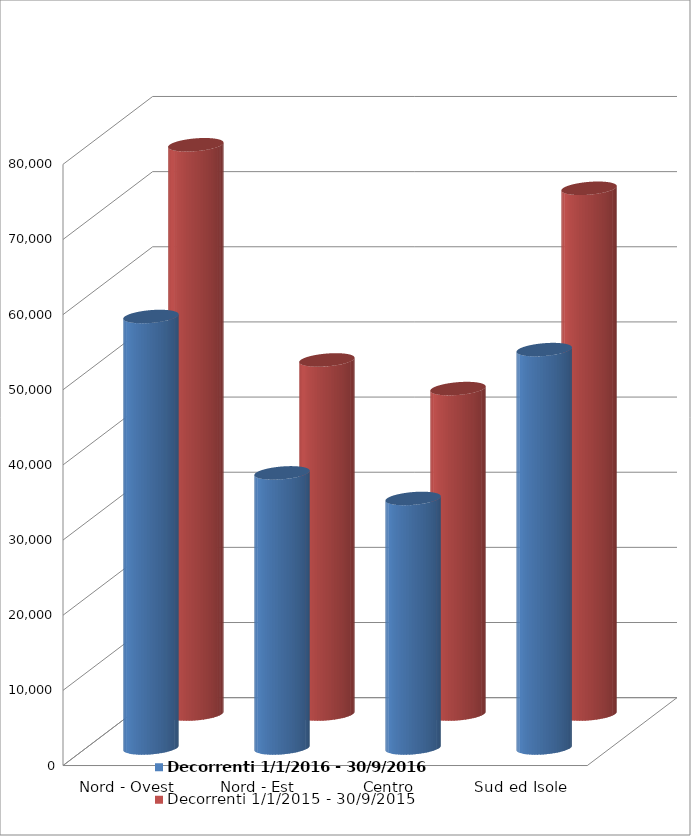
| Category | Decorrenti 1/1/2016 - 30/9/2016 | Decorrenti 1/1/2015 - 30/9/2015 |
|---|---|---|
| Nord - Ovest | 57412 | 75751 |
| Nord - Est | 36602 | 47117 |
| Centro | 33200 | 43306 |
| Sud ed Isole | 53007 | 69960 |